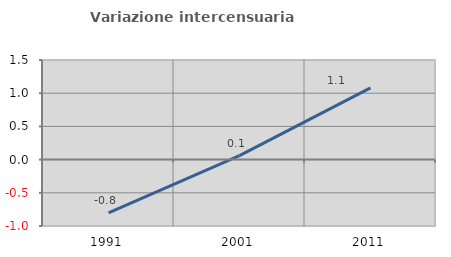
| Category | Variazione intercensuaria annua |
|---|---|
| 1991.0 | -0.804 |
| 2001.0 | 0.06 |
| 2011.0 | 1.08 |